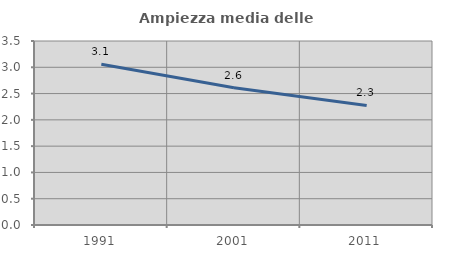
| Category | Ampiezza media delle famiglie |
|---|---|
| 1991.0 | 3.059 |
| 2001.0 | 2.609 |
| 2011.0 | 2.274 |